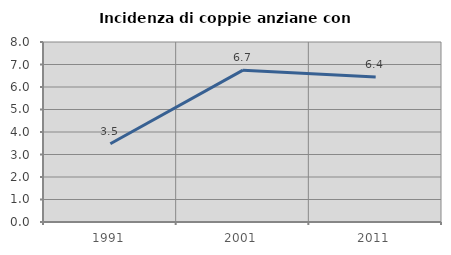
| Category | Incidenza di coppie anziane con figli |
|---|---|
| 1991.0 | 3.477 |
| 2001.0 | 6.748 |
| 2011.0 | 6.447 |